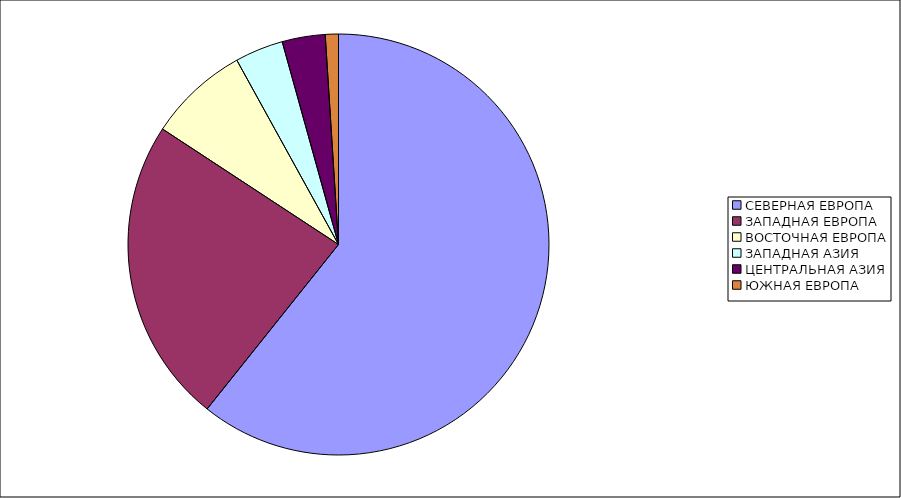
| Category | Оборот |
|---|---|
| СЕВЕРНАЯ ЕВРОПА | 60.727 |
| ЗАПАДНАЯ ЕВРОПА | 23.517 |
| ВОСТОЧНАЯ ЕВРОПА | 7.734 |
| ЗАПАДНАЯ АЗИЯ | 3.712 |
| ЦЕНТРАЛЬНАЯ АЗИЯ | 3.304 |
| ЮЖНАЯ ЕВРОПА | 1.007 |